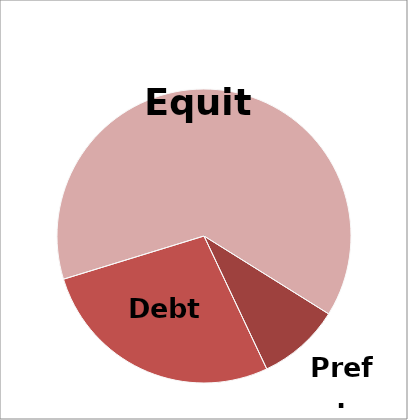
| Category | Claims on Value |
|---|---|
| Pref. Stk. | 1 |
| Debt | 3 |
|  | 7 |